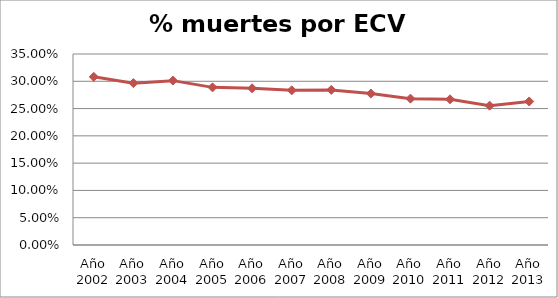
| Category | Series 0 |
|---|---|
| Año 2002 | 0.308 |
| Año 2003 | 0.297 |
| Año 2004 | 0.301 |
| Año 2005 | 0.289 |
| Año 2006 | 0.287 |
| Año 2007 | 0.283 |
| Año 2008 | 0.284 |
| Año 2009 | 0.278 |
| Año 2010 | 0.268 |
| Año 2011 | 0.267 |
| Año 2012 | 0.255 |
| Año 2013 | 0.263 |